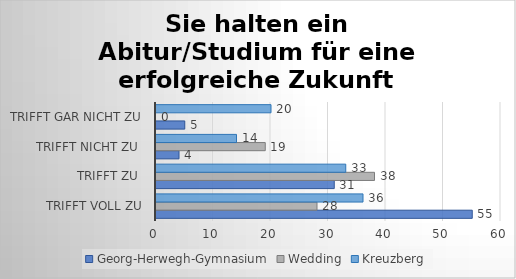
| Category | Georg-Herwegh-Gymnasium | Wedding | Kreuzberg |
|---|---|---|---|
| trifft voll zu | 55 | 28 | 36 |
| trifft zu  | 31 | 38 | 33 |
| trifft nicht zu  | 4 | 19 | 14 |
| trifft gar nicht zu | 5 | 0 | 20 |